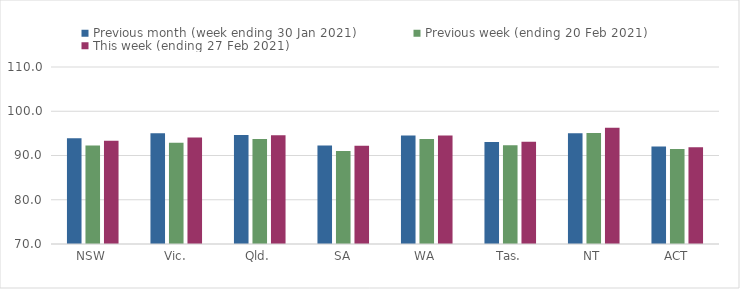
| Category | Previous month (week ending 30 Jan 2021) | Previous week (ending 20 Feb 2021) | This week (ending 27 Feb 2021) |
|---|---|---|---|
| NSW | 93.9 | 92.25 | 93.32 |
| Vic. | 95.05 | 92.89 | 94.04 |
| Qld. | 94.66 | 93.73 | 94.57 |
| SA | 92.25 | 91.01 | 92.19 |
| WA | 94.53 | 93.75 | 94.54 |
| Tas. | 93.05 | 92.29 | 93.13 |
| NT | 95.05 | 95.11 | 96.29 |
| ACT | 92.01 | 91.46 | 91.87 |